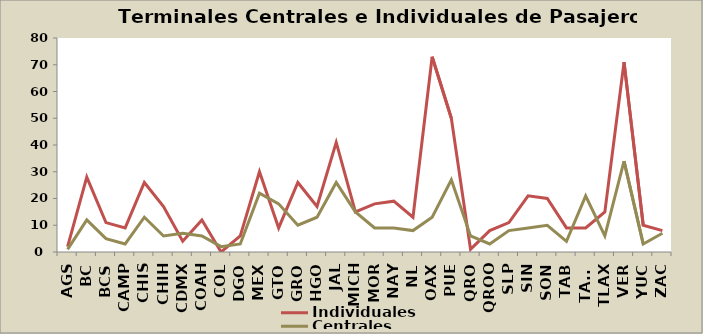
| Category | Individuales | Centrales |
|---|---|---|
| AGS | 2 | 1 |
| BC | 28 | 12 |
| BCS | 11 | 5 |
| CAMP | 9 | 3 |
| CHIS | 26 | 13 |
| CHIH | 17 | 6 |
| CDMX | 4 | 7 |
| COAH | 12 | 6 |
| COL | 0 | 2 |
| DGO | 6 | 3 |
| MEX | 30 | 22 |
| GTO | 9 | 18 |
| GRO | 26 | 10 |
| HGO | 17 | 13 |
| JAL | 41 | 26 |
| MICH | 15 | 15 |
| MOR | 18 | 9 |
| NAY | 19 | 9 |
| NL | 13 | 8 |
| OAX | 73 | 13 |
| PUE | 50 | 27 |
| QRO | 1 | 6 |
| QROO | 8 | 3 |
| SLP | 11 | 8 |
| SIN | 21 | 9 |
| SON | 20 | 10 |
| TAB | 9 | 4 |
| TAMS | 9 | 21 |
| TLAX | 15 | 6 |
| VER | 71 | 34 |
| YUC | 10 | 3 |
| ZAC | 8 | 7 |